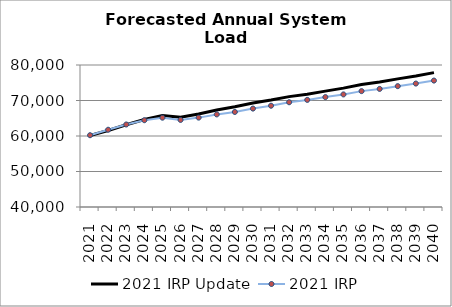
| Category | 2021 IRP Update | 2021 IRP |
|---|---|---|
| 2021.0 | 60131.512 | 60221.57 |
| 2022.0 | 61564.329 | 61760.91 |
| 2023.0 | 63153.008 | 63242.99 |
| 2024.0 | 64661.776 | 64451.31 |
| 2025.0 | 65743.108 | 65162.26 |
| 2026.0 | 65308.289 | 64527.03 |
| 2027.0 | 66210.48 | 65178.4 |
| 2028.0 | 67345.991 | 66083.42 |
| 2029.0 | 68250.252 | 66768.66 |
| 2030.0 | 69298.256 | 67723.21 |
| 2031.0 | 70122.893 | 68528.65 |
| 2032.0 | 71088.901 | 69507.21 |
| 2033.0 | 71784.679 | 70170.85 |
| 2034.0 | 72638.004 | 70955.08 |
| 2035.0 | 73484.264 | 71713.38 |
| 2036.0 | 74507.41 | 72641.24 |
| 2037.0 | 75225.321 | 73263.63 |
| 2038.0 | 76093.473 | 74042.54 |
| 2039.0 | 76912.44 | 74771.42 |
| 2040.0 | 77850.137 | 75613.33 |